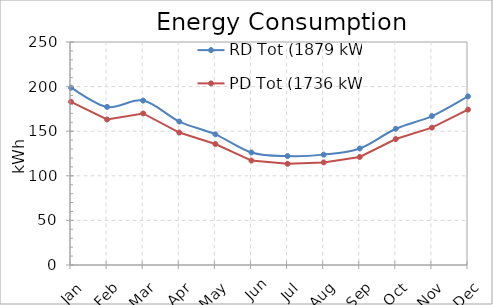
| Category | RD Tot (1879 kWh) | PD Tot (1736 kWh) |
|---|---|---|
| Jan | 198.737 | 182.949 |
| Feb | 177.21 | 163.165 |
| Mar | 184.328 | 169.889 |
| Apr | 160.827 | 148.498 |
| May | 146.493 | 135.597 |
| Jun | 126.168 | 117.084 |
| Jul | 122.081 | 113.471 |
| Aug | 123.74 | 114.974 |
| Sep | 130.582 | 121.085 |
| Oct | 152.712 | 141.234 |
| Nov | 166.896 | 153.998 |
| Dec | 189.045 | 174.164 |